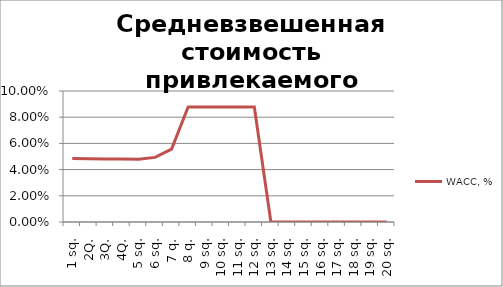
| Category | WACC, % |
|---|---|
| 1 sq. | 0.048 |
| 2Q. | 0.048 |
| 3Q. | 0.048 |
| 4Q. | 0.048 |
| 5 sq. | 0.048 |
| 6 sq. | 0.049 |
| 7 q. | 0.056 |
| 8 q. | 0.088 |
| 9 sq. | 0.088 |
| 10 sq. | 0.088 |
| 11 sq. | 0.088 |
| 12 sq. | 0.088 |
| 13 sq. | 0 |
| 14 sq. | 0 |
| 15 sq. | 0 |
| 16 sq. | 0 |
| 17 sq. | 0 |
| 18 sq. | 0 |
| 19 sq. | 0 |
| 20 sq. | 0 |